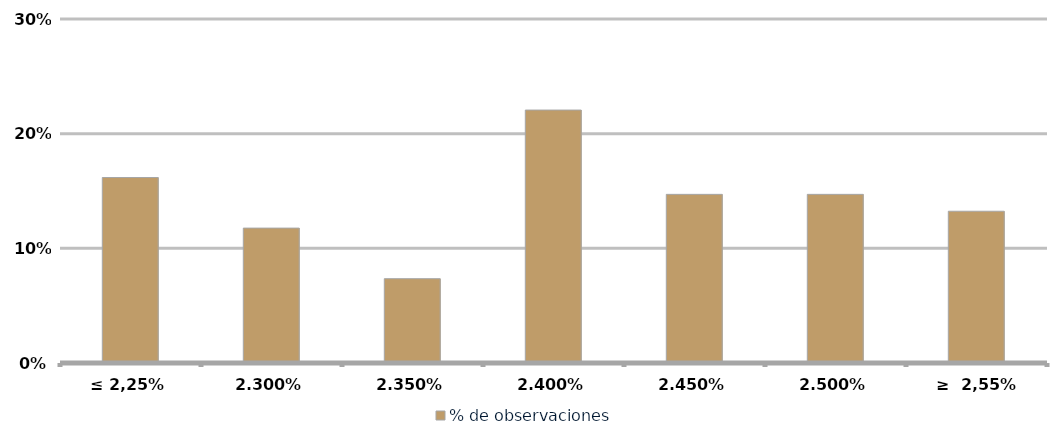
| Category | % de observaciones  |
|---|---|
| ≤ 2,25% | 0.162 |
| 2,30% | 0.118 |
| 2,35% | 0.074 |
| 2,40% | 0.221 |
| 2,45% | 0.147 |
| 2,50% | 0.147 |
| ≥  2,55% | 0.132 |